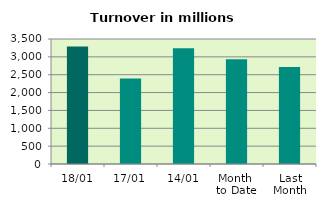
| Category | Series 0 |
|---|---|
| 18/01 | 3287.368 |
| 17/01 | 2396.015 |
| 14/01 | 3243.918 |
| Month 
to Date | 2931.318 |
| Last
Month | 2717.391 |